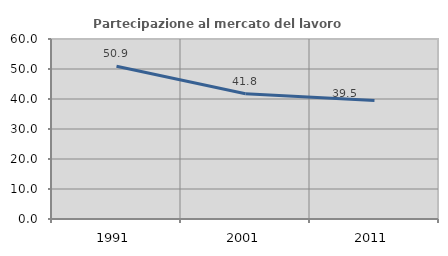
| Category | Partecipazione al mercato del lavoro  femminile |
|---|---|
| 1991.0 | 50.92 |
| 2001.0 | 41.779 |
| 2011.0 | 39.501 |